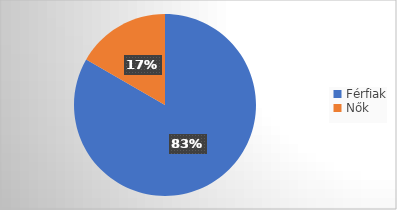
| Category | Series 0 |
|---|---|
| Férfiak | 75 |
| Nők | 15 |